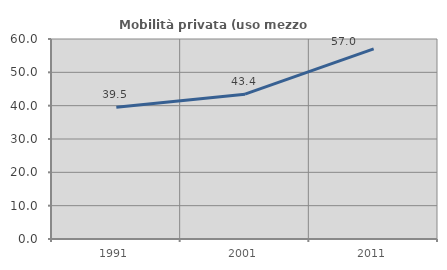
| Category | Mobilità privata (uso mezzo privato) |
|---|---|
| 1991.0 | 39.526 |
| 2001.0 | 43.438 |
| 2011.0 | 57.035 |